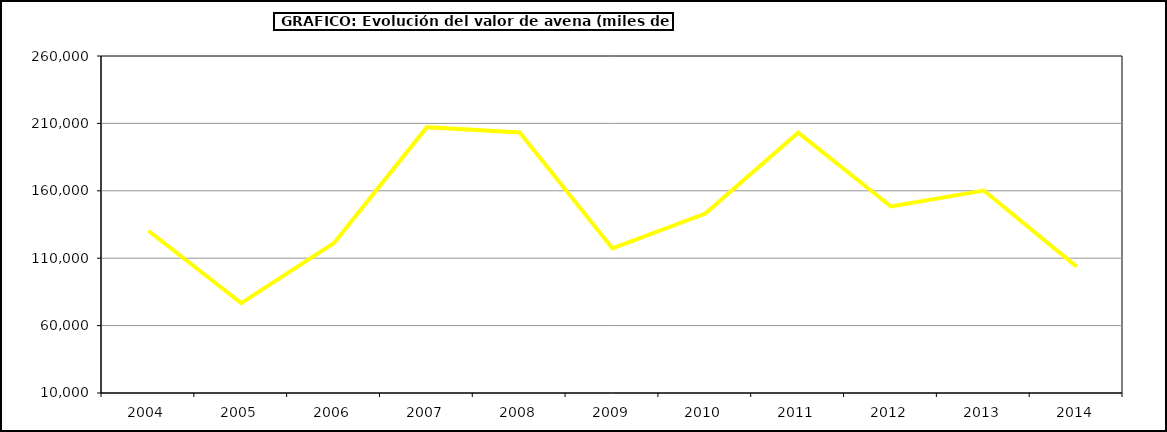
| Category | Valor |
|---|---|
| 2004.0 | 130371.875 |
| 2005.0 | 76708.282 |
| 2006.0 | 121358.72 |
| 2007.0 | 207233.299 |
| 2008.0 | 203323.263 |
| 2009.0 | 117248.747 |
| 2010.0 | 143145.142 |
| 2011.0 | 203137.341 |
| 2012.0 | 148383.942 |
| 2013.0 | 160216.853 |
| 2014.0 | 103741 |